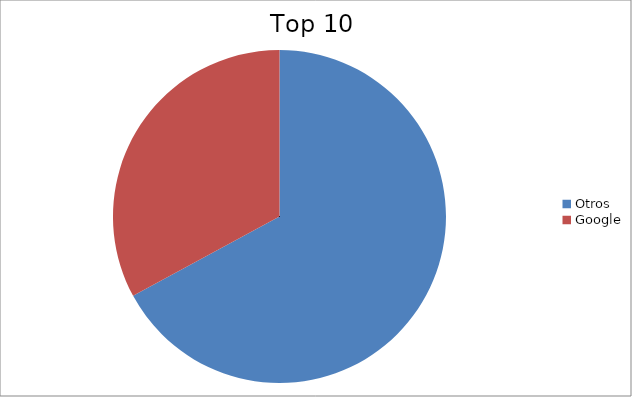
| Category | Series 0 |
|---|---|
| Otros | 67.1 |
| Google | 32.9 |